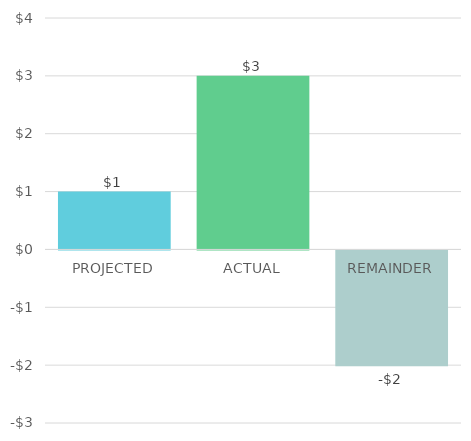
| Category | Series 0 |
|---|---|
| PROJECTED | 1 |
| ACTUAL | 3 |
| REMAINDER | -2 |